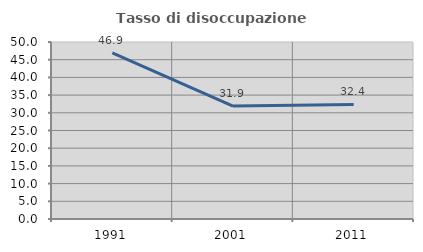
| Category | Tasso di disoccupazione giovanile  |
|---|---|
| 1991.0 | 46.939 |
| 2001.0 | 31.915 |
| 2011.0 | 32.353 |